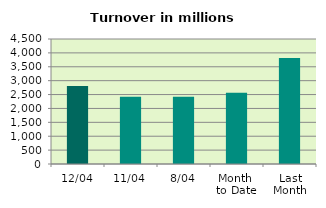
| Category | Series 0 |
|---|---|
| 12/04 | 2805.414 |
| 11/04 | 2422.236 |
| 8/04 | 2422.219 |
| Month 
to Date | 2562.499 |
| Last
Month | 3816.191 |